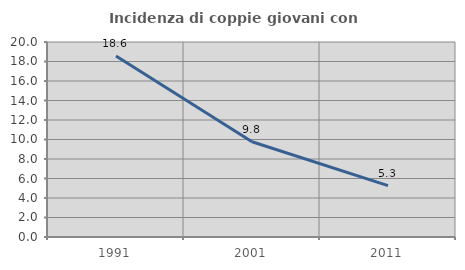
| Category | Incidenza di coppie giovani con figli |
|---|---|
| 1991.0 | 18.565 |
| 2001.0 | 9.769 |
| 2011.0 | 5.263 |